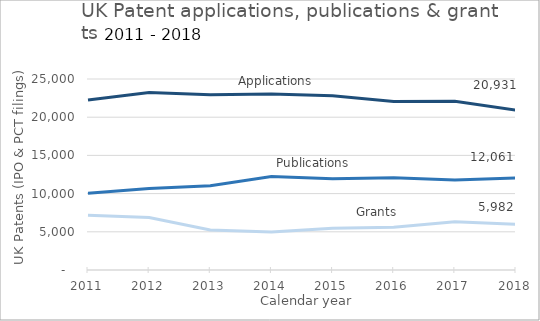
| Category | Applications | Publications | Grants |
|---|---|---|---|
| 2011 | 22256 | 10043 | 7173 |
| 2012 | 23229 | 10653 | 6864 |
| 2013 | 22936 | 11021 | 5235 |
| 2014 | 23040 | 12227 | 4986 |
| 2015 | 22801 | 11939 | 5464 |
| 2016 | 22055 | 12065 | 5602 |
| 2017 | 22072 | 11768 | 6311 |
| 2018 | 20931 | 12061 | 5982 |